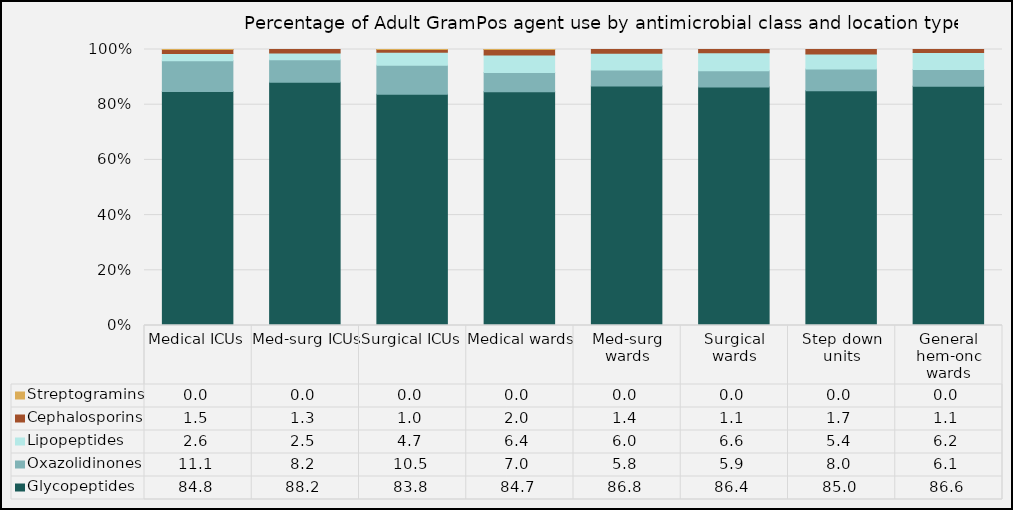
| Category | Glycopeptides | Oxazolidinones | Lipopeptides | Cephalosporins | Streptogramins |
|---|---|---|---|---|---|
| Medical ICUs | 84.78 | 11.11 | 2.63 | 1.47 | 0.01 |
| Med-surg ICUs | 88.15 | 8.15 | 2.45 | 1.25 | 0 |
| Surgical ICUs | 83.83 | 10.45 | 4.69 | 1.03 | 0.01 |
| Medical wards | 84.67 | 6.99 | 6.36 | 1.98 | 0.01 |
| Med-surg wards | 86.76 | 5.83 | 6.04 | 1.36 | 0 |
| Surgical wards | 86.36 | 5.93 | 6.56 | 1.14 | 0 |
| Step down units | 85.01 | 7.96 | 5.35 | 1.67 | 0 |
| General hem-onc wards | 86.64 | 6.11 | 6.2 | 1.05 | 0 |